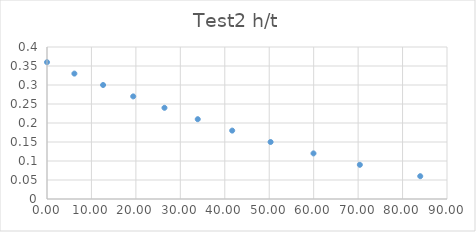
| Category | Series 0 |
|---|---|
| 0.0 | 0.36 |
| 6.16 | 0.33 |
| 12.62 | 0.3 |
| 19.4 | 0.27 |
| 26.43 | 0.24 |
| 33.92 | 0.21 |
| 41.67 | 0.18 |
| 50.31 | 0.15 |
| 59.96 | 0.12 |
| 70.39 | 0.09 |
| 83.98 | 0.06 |